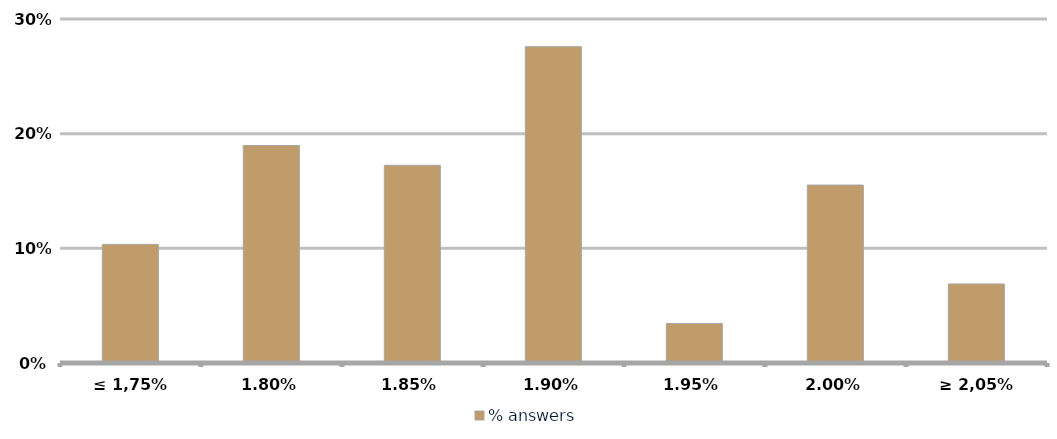
| Category | % answers |
|---|---|
| ≤ 1,75% | 0.103 |
| 1,80% | 0.19 |
| 1,85% | 0.172 |
| 1,90% | 0.276 |
| 1,95% | 0.034 |
| 2,00% | 0.155 |
| ≥ 2,05% | 0.069 |